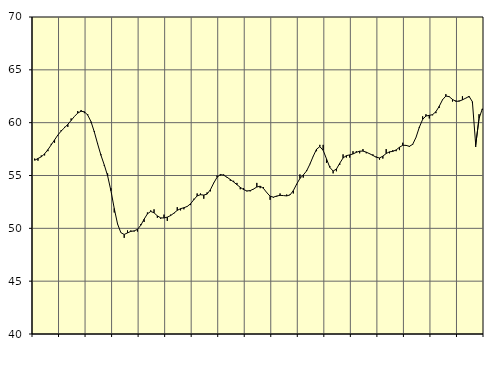
| Category | Piggar | Samtliga fast anställda (inkl. fast anställda utomlands) |
|---|---|---|
| nan | 56.6 | 56.44 |
| 87.0 | 56.4 | 56.61 |
| 87.0 | 56.9 | 56.77 |
| 87.0 | 56.9 | 57.05 |
| nan | 57.3 | 57.45 |
| 88.0 | 58 | 57.9 |
| 88.0 | 58.1 | 58.37 |
| 88.0 | 58.8 | 58.83 |
| nan | 59.3 | 59.21 |
| 89.0 | 59.6 | 59.52 |
| 89.0 | 59.6 | 59.84 |
| 89.0 | 60.4 | 60.21 |
| nan | 60.6 | 60.59 |
| 90.0 | 61.1 | 60.91 |
| 90.0 | 61.2 | 61.08 |
| 90.0 | 60.9 | 61.03 |
| nan | 60.8 | 60.72 |
| 91.0 | 60 | 60.09 |
| 91.0 | 59.2 | 59.11 |
| 91.0 | 58 | 57.98 |
| nan | 57 | 56.91 |
| 92.0 | 55.9 | 55.99 |
| 92.0 | 55.2 | 54.97 |
| 92.0 | 53.8 | 53.56 |
| nan | 51.5 | 51.88 |
| 93.0 | 50.4 | 50.41 |
| 93.0 | 49.6 | 49.59 |
| 93.0 | 49.1 | 49.42 |
| nan | 49.8 | 49.57 |
| 94.0 | 49.8 | 49.71 |
| 94.0 | 49.7 | 49.76 |
| 94.0 | 49.7 | 49.9 |
| nan | 50.4 | 50.29 |
| 95.0 | 50.6 | 50.86 |
| 95.0 | 51.5 | 51.37 |
| 95.0 | 51.7 | 51.6 |
| nan | 51.8 | 51.47 |
| 96.0 | 51 | 51.18 |
| 96.0 | 50.9 | 50.99 |
| 96.0 | 51.3 | 50.98 |
| nan | 50.7 | 51.06 |
| 97.0 | 51.3 | 51.21 |
| 97.0 | 51.4 | 51.44 |
| 97.0 | 52 | 51.7 |
| nan | 51.7 | 51.86 |
| 98.0 | 51.8 | 51.95 |
| 98.0 | 52.1 | 52.07 |
| 98.0 | 52.2 | 52.32 |
| nan | 52.8 | 52.71 |
| 99.0 | 53.3 | 53.07 |
| 99.0 | 53.3 | 53.18 |
| 99.0 | 52.8 | 53.15 |
| nan | 53.4 | 53.24 |
| 0.0 | 53.5 | 53.66 |
| 0.0 | 54.3 | 54.29 |
| 0.0 | 55 | 54.83 |
| nan | 55 | 55.09 |
| 1.0 | 55.1 | 55.03 |
| 1.0 | 54.8 | 54.84 |
| 1.0 | 54.5 | 54.62 |
| nan | 54.5 | 54.39 |
| 2.0 | 54.3 | 54.13 |
| 2.0 | 53.7 | 53.88 |
| 2.0 | 53.8 | 53.67 |
| nan | 53.5 | 53.54 |
| 3.0 | 53.5 | 53.57 |
| 3.0 | 53.7 | 53.72 |
| 3.0 | 54.3 | 53.91 |
| nan | 53.8 | 53.99 |
| 4.0 | 53.9 | 53.78 |
| 4.0 | 53.4 | 53.38 |
| 4.0 | 52.7 | 53.04 |
| nan | 52.9 | 52.95 |
| 5.0 | 53 | 53.06 |
| 5.0 | 53.3 | 53.12 |
| 5.0 | 53.1 | 53.1 |
| nan | 53.2 | 53.07 |
| 6.0 | 53.2 | 53.16 |
| 6.0 | 53.3 | 53.57 |
| 6.0 | 54.1 | 54.18 |
| nan | 55.1 | 54.72 |
| 7.0 | 54.8 | 55.05 |
| 7.0 | 55.5 | 55.43 |
| 7.0 | 56.1 | 56.07 |
| nan | 56.8 | 56.82 |
| 8.0 | 57.3 | 57.49 |
| 8.0 | 57.9 | 57.73 |
| 8.0 | 57.9 | 57.38 |
| nan | 56.2 | 56.58 |
| 9.0 | 55.9 | 55.77 |
| 9.0 | 55.2 | 55.42 |
| 9.0 | 55.4 | 55.61 |
| nan | 56 | 56.16 |
| 10.0 | 57 | 56.66 |
| 10.0 | 56.7 | 56.88 |
| 10.0 | 56.7 | 56.95 |
| nan | 57.3 | 57.04 |
| 11.0 | 57.3 | 57.19 |
| 11.0 | 57.1 | 57.3 |
| 11.0 | 57.5 | 57.31 |
| nan | 57.1 | 57.21 |
| 12.0 | 57.1 | 57.06 |
| 12.0 | 57 | 56.9 |
| 12.0 | 56.8 | 56.73 |
| nan | 56.5 | 56.66 |
| 13.0 | 56.6 | 56.83 |
| 13.0 | 57.5 | 57.08 |
| 13.0 | 57.1 | 57.24 |
| nan | 57.4 | 57.28 |
| 14.0 | 57.3 | 57.42 |
| 14.0 | 57.4 | 57.67 |
| 14.0 | 58.1 | 57.86 |
| nan | 57.8 | 57.85 |
| 15.0 | 57.7 | 57.76 |
| 15.0 | 57.9 | 57.95 |
| 15.0 | 58.6 | 58.61 |
| nan | 59.5 | 59.57 |
| 16.0 | 60.6 | 60.31 |
| 16.0 | 60.8 | 60.63 |
| 16.0 | 60.4 | 60.69 |
| nan | 60.7 | 60.76 |
| 17.0 | 60.9 | 61.04 |
| 17.0 | 61.4 | 61.55 |
| 17.0 | 62.2 | 62.17 |
| nan | 62.7 | 62.52 |
| 18.0 | 62.5 | 62.46 |
| 18.0 | 62 | 62.2 |
| 18.0 | 62.1 | 62.02 |
| nan | 62.1 | 62.03 |
| 19.0 | 62.5 | 62.16 |
| 19.0 | 62.3 | 62.32 |
| 19.0 | 62.4 | 62.49 |
| nan | 61.9 | 61.98 |
| 20.0 | 57.7 | 57.89 |
| 20.0 | 60.8 | 60.4 |
| 20.0 | 61.2 | 61.31 |